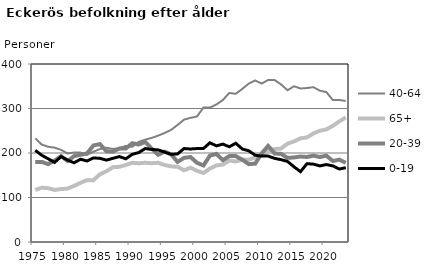
| Category | 40-64 | 65+ | 20-39 | 0-19 |
|---|---|---|---|---|
| 1975.0 | 233 | 117 | 180 | 206 |
| 1976.0 | 219 | 122 | 180 | 195 |
| 1977.0 | 214 | 121 | 175 | 187 |
| 1978.0 | 212 | 117 | 183 | 179 |
| 1979.0 | 207 | 119 | 193 | 192 |
| 1980.0 | 199 | 120 | 182 | 184 |
| 1981.0 | 201 | 126 | 193 | 178 |
| 1982.0 | 201 | 133 | 196 | 186 |
| 1983.0 | 196 | 139 | 199 | 182 |
| 1984.0 | 203 | 139 | 217 | 189 |
| 1985.0 | 209 | 152 | 220 | 188 |
| 1986.0 | 212 | 159 | 204 | 184 |
| 1987.0 | 209 | 168 | 203 | 188 |
| 1988.0 | 211 | 169 | 210 | 192 |
| 1989.0 | 216 | 173 | 210 | 187 |
| 1990.0 | 214 | 178 | 222 | 197 |
| 1991.0 | 225 | 177 | 219 | 201 |
| 1992.0 | 230 | 178 | 225 | 210 |
| 1993.0 | 234 | 177 | 210 | 208 |
| 1994.0 | 239 | 178 | 196 | 207 |
| 1995.0 | 245 | 173 | 203 | 202 |
| 1996.0 | 252 | 170 | 197 | 197 |
| 1997.0 | 263 | 169 | 180 | 198 |
| 1998.0 | 275 | 161 | 189 | 210 |
| 1999.0 | 279 | 167 | 191 | 209 |
| 2000.0 | 282 | 160 | 178 | 210 |
| 2001.0 | 302 | 155 | 172 | 210 |
| 2002.0 | 302 | 165 | 194 | 223 |
| 2003.0 | 309 | 172 | 198 | 216 |
| 2004.0 | 319 | 174 | 184 | 220 |
| 2005.0 | 335 | 183 | 193 | 214 |
| 2006.0 | 333 | 181 | 193 | 222 |
| 2007.0 | 344 | 185 | 185 | 209 |
| 2008.0 | 356 | 185 | 175 | 205 |
| 2009.0 | 363 | 190 | 176 | 195 |
| 2010.0 | 356 | 195 | 199 | 193 |
| 2011.0 | 364 | 205 | 216 | 193 |
| 2012.0 | 364 | 209 | 199 | 188 |
| 2013.0 | 354 | 210 | 198 | 185 |
| 2014.0 | 341 | 221 | 189 | 181 |
| 2015.0 | 350 | 226 | 190 | 169 |
| 2016.0 | 345 | 233 | 192 | 158 |
| 2017.0 | 346 | 235 | 191 | 176 |
| 2018.0 | 348 | 244 | 194 | 175 |
| 2019.0 | 340 | 250 | 191 | 171 |
| 2020.0 | 337 | 253 | 194 | 174 |
| 2021.0 | 319 | 261 | 182 | 171 |
| 2022.0 | 319 | 271 | 185 | 164 |
| 2023.0 | 317 | 280 | 178 | 167 |